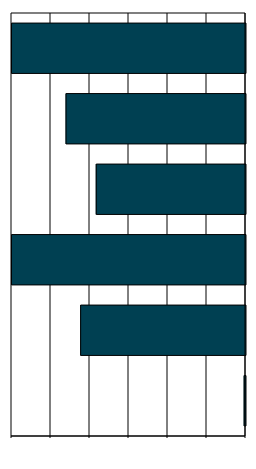
| Category | Series 0 |
|---|---|
| 0 | -0.069 |
| 1 | -8.454 |
| 2 | -12.36 |
| 3 | -7.655 |
| 4 | -9.204 |
| 5 | -34.051 |